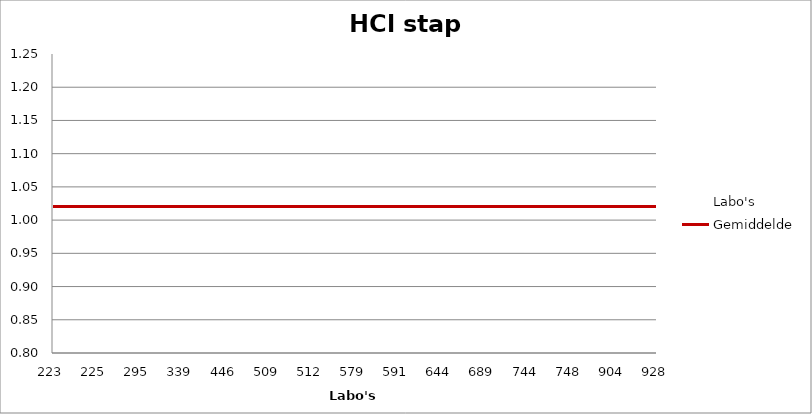
| Category | Labo's | Gemiddelde |
|---|---|---|
| 223.0 | 1.18 | 1.02 |
| 225.0 | 1.095 | 1.02 |
| 295.0 | 0.98 | 1.02 |
| 339.0 | 1.066 | 1.02 |
| 446.0 | 1.226 | 1.02 |
| 509.0 | 1.056 | 1.02 |
| 512.0 | 1.02 | 1.02 |
| 579.0 | 0.938 | 1.02 |
| 591.0 | 0.954 | 1.02 |
| 644.0 | 0.852 | 1.02 |
| 689.0 | 1.046 | 1.02 |
| 744.0 | 0.948 | 1.02 |
| 748.0 | 0.82 | 1.02 |
| 904.0 | 1.016 | 1.02 |
| 928.0 | 1.111 | 1.02 |